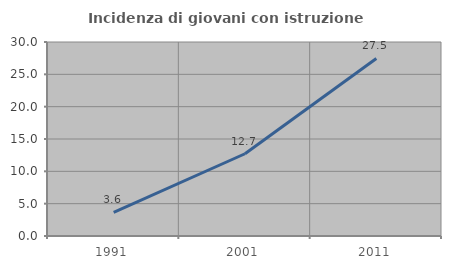
| Category | Incidenza di giovani con istruzione universitaria |
|---|---|
| 1991.0 | 3.636 |
| 2001.0 | 12.719 |
| 2011.0 | 27.459 |